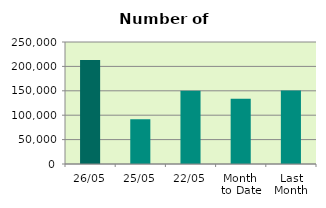
| Category | Series 0 |
|---|---|
| 26/05 | 213190 |
| 25/05 | 91876 |
| 22/05 | 150016 |
| Month 
to Date | 133895.059 |
| Last
Month | 150855.6 |